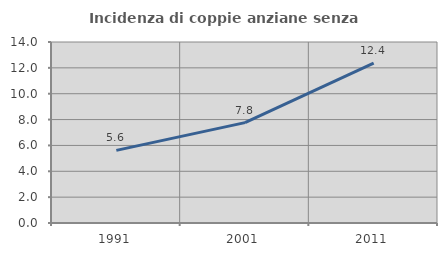
| Category | Incidenza di coppie anziane senza figli  |
|---|---|
| 1991.0 | 5.618 |
| 2001.0 | 7.765 |
| 2011.0 | 12.36 |